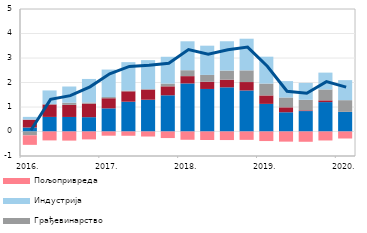
| Category | Остале делатности | Трговина | Грађевинарство | Индустрија | Пољопривреда |
|---|---|---|---|---|---|
| 2016. | 0.163 | 0.321 | -0.156 | 0.113 | -0.39 |
| II | 0.595 | 0.508 | 0.015 | 0.558 | -0.363 |
| III | 0.594 | 0.494 | 0.088 | 0.66 | -0.372 |
| IV | 0.585 | 0.553 | 0.046 | 0.96 | -0.322 |
| 2017. | 0.945 | 0.413 | 0.049 | 1.121 | -0.172 |
| II | 1.216 | 0.424 | 0.032 | 1.158 | -0.174 |
| III | 1.297 | 0.414 | 0.02 | 1.182 | -0.205 |
| IV | 1.478 | 0.366 | 0.113 | 1.094 | -0.268 |
| 2018. | 1.962 | 0.298 | 0.242 | 1.18 | -0.338 |
| II | 1.736 | 0.292 | 0.281 | 1.193 | -0.346 |
| III | 1.803 | 0.311 | 0.372 | 1.197 | -0.349 |
| IV | 1.675 | 0.344 | 0.476 | 1.293 | -0.341 |
| 2019. | 1.127 | 0.345 | 0.485 | 1.097 | -0.39 |
| II | 0.785 | 0.202 | 0.402 | 0.668 | -0.414 |
| III | 0.834 | 0.029 | 0.43 | 0.691 | -0.42 |
| IV | 1.2 | 0.072 | 0.444 | 0.687 | -0.366 |
| 2020. | 0.799 | 0.004 | 0.477 | 0.817 | -0.286 |